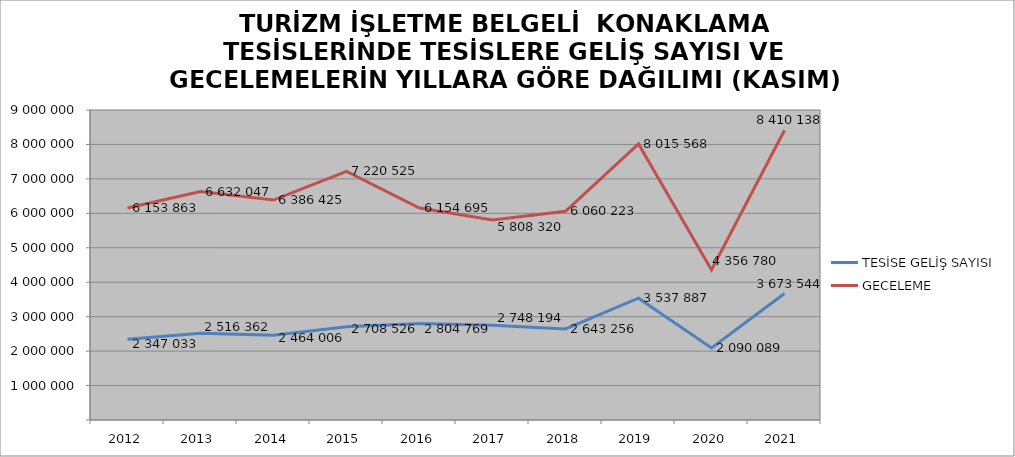
| Category | TESİSE GELİŞ SAYISI | GECELEME |
|---|---|---|
| 2012 | 2347033 | 6153863 |
| 2013 | 2516362 | 6632047 |
| 2014 | 2464006 | 6386425 |
| 2015 | 2708526 | 7220525 |
| 2016 | 2804769 | 6154695 |
| 2017 | 2748194 | 5808320 |
| 2018 | 2643256 | 6060223 |
| 2019 | 3537887 | 8015568 |
| 2020 | 2090089 | 4356780 |
| 2021 | 3673544 | 8410138 |